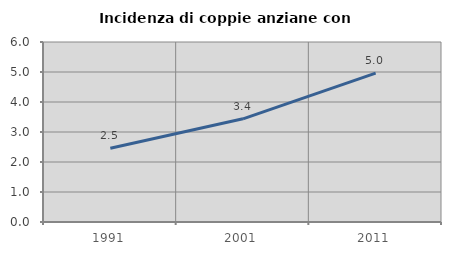
| Category | Incidenza di coppie anziane con figli |
|---|---|
| 1991.0 | 2.461 |
| 2001.0 | 3.439 |
| 2011.0 | 4.963 |